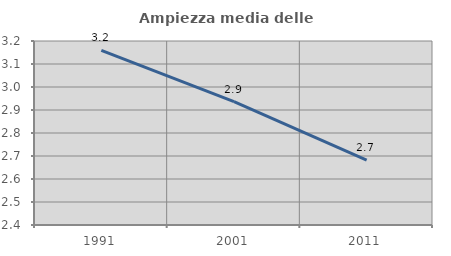
| Category | Ampiezza media delle famiglie |
|---|---|
| 1991.0 | 3.159 |
| 2001.0 | 2.936 |
| 2011.0 | 2.682 |